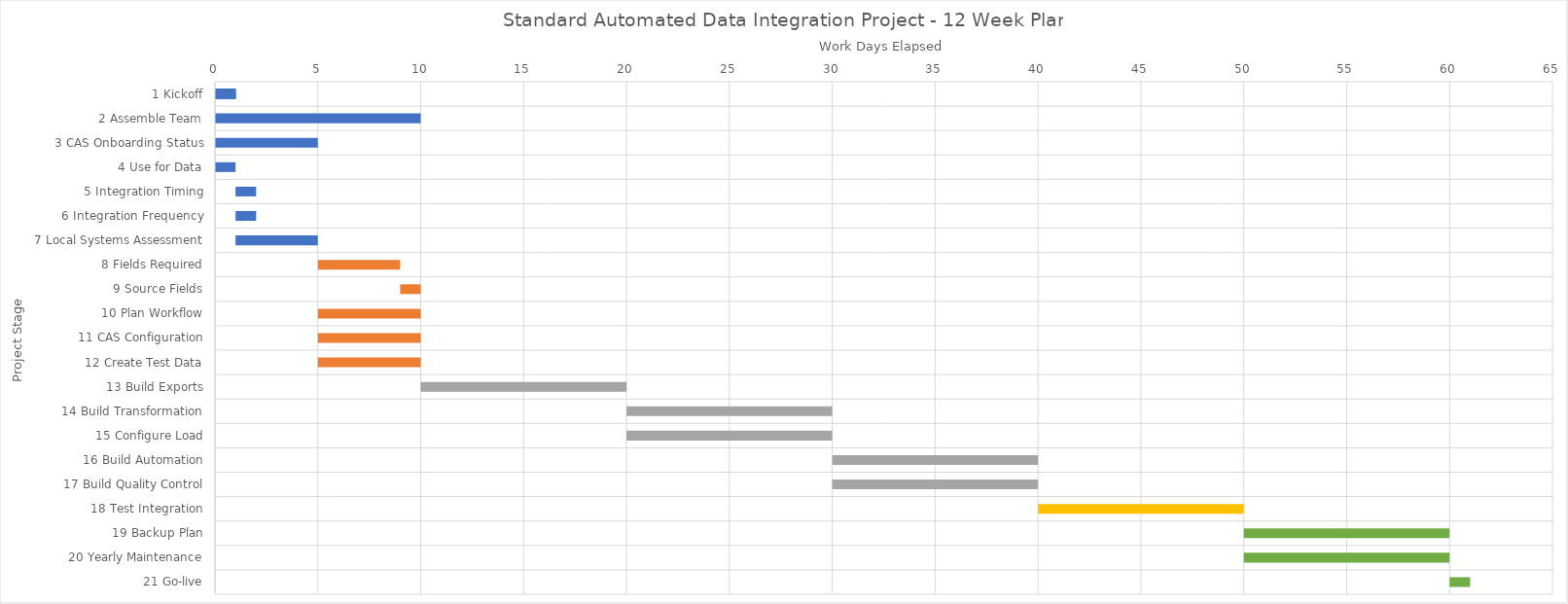
| Category | Days After Start | Duration (Days) |
|---|---|---|
| 1 Kickoff | 0 | 1 |
| 2 Assemble Team | 0 | 10 |
| 3 CAS Onboarding Status | 0 | 5 |
| 4 Use for Data | 0 | 1 |
| 5 Integration Timing | 1 | 1 |
| 6 Integration Frequency | 1 | 1 |
| 7 Local Systems Assessment | 1 | 4 |
| 8 Fields Required | 5 | 4 |
| 9 Source Fields | 9 | 1 |
| 10 Plan Workflow | 5 | 5 |
| 11 CAS Configuration | 5 | 5 |
| 12 Create Test Data | 5 | 5 |
| 13 Build Exports | 10 | 10 |
| 14 Build Transformation | 20 | 10 |
| 15 Configure Load | 20 | 10 |
| 16 Build Automation | 30 | 10 |
| 17 Build Quality Control | 30 | 10 |
| 18 Test Integration | 40 | 10 |
| 19 Backup Plan | 50 | 10 |
| 20 Yearly Maintenance | 50 | 10 |
| 21 Go-live | 60 | 1 |